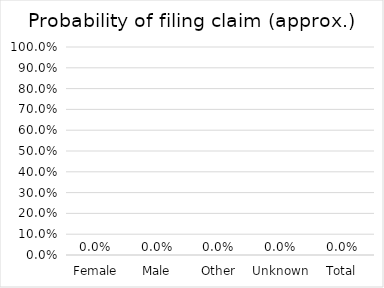
| Category |  Probability of filing claim (approx.)  |
|---|---|
| Female | 0 |
| Male | 0 |
| Other | 0 |
| Unknown | 0 |
| Total | 0 |